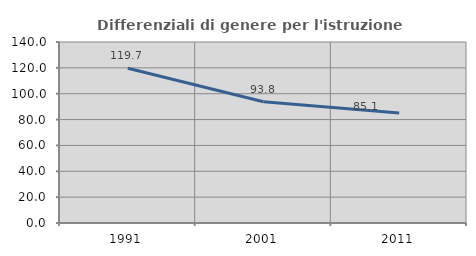
| Category | Differenziali di genere per l'istruzione superiore |
|---|---|
| 1991.0 | 119.676 |
| 2001.0 | 93.767 |
| 2011.0 | 85.071 |